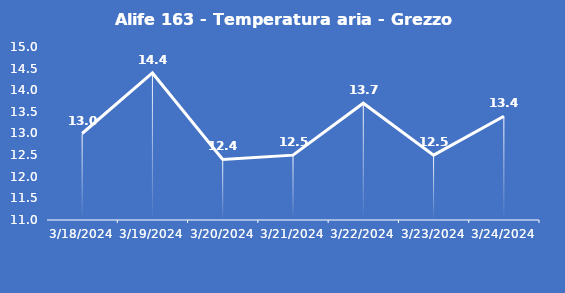
| Category | Alife 163 - Temperatura aria - Grezzo (°C) |
|---|---|
| 3/18/24 | 13 |
| 3/19/24 | 14.4 |
| 3/20/24 | 12.4 |
| 3/21/24 | 12.5 |
| 3/22/24 | 13.7 |
| 3/23/24 | 12.5 |
| 3/24/24 | 13.4 |